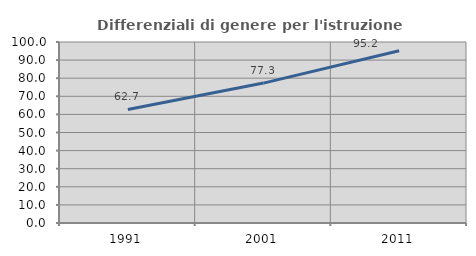
| Category | Differenziali di genere per l'istruzione superiore |
|---|---|
| 1991.0 | 62.73 |
| 2001.0 | 77.298 |
| 2011.0 | 95.207 |